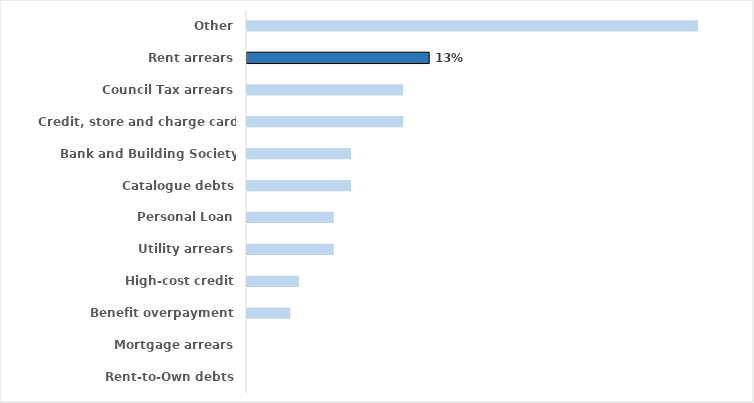
| Category | Series 0 |
|---|---|
| Other | 0.317 |
| Rent arrears | 0.128 |
| Council Tax arrears | 0.11 |
| Credit, store and charge card debts | 0.11 |
| Bank and Building Society overdrafts | 0.073 |
| Catalogue debts | 0.073 |
| Personal Loan | 0.061 |
| Utility arrears | 0.061 |
| High-cost credit | 0.037 |
| Benefit overpayment | 0.03 |
| Mortgage arrears | 0 |
| Rent-to-Own debts | 0 |